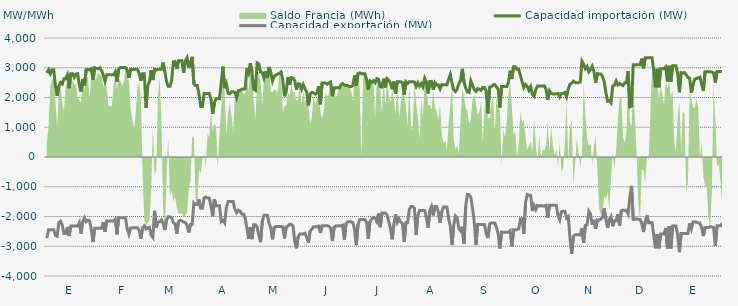
| Category | Capacidad importación (MW) | Capacidad exportación (MW) |
|---|---|---|
| 0 | 2825 | -2729.167 |
| 1900-01-01 | 2933.333 | -2441.667 |
| 1900-01-02 | 2795.833 | -2441.667 |
| 1900-01-03 | 2933.333 | -2441.667 |
| 1900-01-04 | 2933.333 | -2441.667 |
| 1900-01-05 | 2397.917 | -2637.5 |
| 1900-01-06 | 2056.25 | -2662.5 |
| 1900-01-07 | 2383.333 | -2202.083 |
| 1900-01-08 | 2500 | -2154.167 |
| 1900-01-09 | 2450 | -2293.75 |
| 1900-01-10 | 2633.333 | -2570.833 |
| 1900-01-11 | 2633.333 | -2570.833 |
| 1900-01-12 | 2762.5 | -2352.083 |
| 1900-01-13 | 2312.5 | -2656.25 |
| 1900-01-14 | 2800 | -2322.917 |
| 1900-01-15 | 2800 | -2322.917 |
| 1900-01-16 | 2683.333 | -2322.917 |
| 1900-01-17 | 2787.5 | -2322.917 |
| 1900-01-18 | 2800 | -2322.917 |
| 1900-01-19 | 2412.5 | -2206.25 |
| 1900-01-20 | 2200 | -2575 |
| 1900-01-21 | 2616.667 | -2170.833 |
| 1900-01-22 | 2404.167 | -2045.833 |
| 1900-01-23 | 2937.5 | -2170.833 |
| 1900-01-24 | 2941.667 | -2125 |
| 1900-01-25 | 2925 | -2145.833 |
| 1900-01-26 | 2968.75 | -2437.5 |
| 1900-01-27 | 2593.75 | -2854.167 |
| 1900-01-28 | 3000 | -2395.833 |
| 1900-01-29 | 2979.167 | -2395.833 |
| 1900-01-30 | 2964.583 | -2395.833 |
| 1900-01-31 | 3000 | -2395.833 |
| 1900-02-01 | 2906.25 | -2395.833 |
| 1900-02-02 | 2750 | -2187.5 |
| 1900-02-03 | 2550 | -2512.5 |
| 1900-02-04 | 2766.667 | -2154.167 |
| 1900-02-05 | 2766.667 | -2154.167 |
| 1900-02-06 | 2766.667 | -2154.167 |
| 1900-02-07 | 2766.667 | -2154.167 |
| 1900-02-08 | 2766.667 | -2154.167 |
| 1900-02-09 | 2862.5 | -2093.75 |
| 1900-02-10 | 2529.167 | -2604.167 |
| 1900-02-11 | 2945.833 | -2041.667 |
| 1900-02-12 | 3008.333 | -2041.667 |
| 1900-02-13 | 3008.333 | -2041.667 |
| 1900-02-14 | 3008.333 | -2041.667 |
| 1900-02-15 | 3008.333 | -2041.667 |
| 1900-02-16 | 2922.917 | -2412.5 |
| 1900-02-17 | 2662.5 | -2600 |
| 1900-02-18 | 2945.833 | -2389.583 |
| 1900-02-19 | 2945.833 | -2377.083 |
| 1900-02-20 | 2945.833 | -2377.083 |
| 1900-02-21 | 2945.833 | -2377.083 |
| 1900-02-22 | 2945.833 | -2379.167 |
| 1900-02-23 | 2812.5 | -2462.5 |
| 1900-02-24 | 2562.5 | -2741.667 |
| 1900-02-25 | 2802.083 | -2377.083 |
| 1900-02-26 | 2800 | -2312.5 |
| 1900-02-27 | 1650 | -2420.833 |
| 1900-02-28 | 2400 | -2379.167 |
| 1900-02-28 | 2533.333 | -2362.5 |
| 1900-03-01 | 2918.75 | -2622.917 |
| 1900-03-02 | 2587.5 | -2702.083 |
| 1900-03-03 | 2947.917 | -1808.333 |
| 1900-03-04 | 2922.917 | -2372.917 |
| 1900-03-05 | 2947.917 | -2181.25 |
| 1900-03-06 | 2947.917 | -2181.25 |
| 1900-03-07 | 2947.917 | -2114.583 |
| 1900-03-08 | 3175 | -2225 |
| 1900-03-09 | 2875 | -2454.167 |
| 1900-03-10 | 2535.417 | -2108.333 |
| 1900-03-11 | 2375 | -2012.5 |
| 1900-03-12 | 2375 | -2012.5 |
| 1900-03-13 | 2566.667 | -2043.75 |
| 1900-03-14 | 3200 | -2208.333 |
| 1900-03-15 | 3212.5 | -2250 |
| 1900-03-16 | 2962.5 | -2579.167 |
| 1900-03-17 | 3233.333 | -2166.667 |
| 1900-03-18 | 3233.333 | -2122.917 |
| 1900-03-19 | 3233.333 | -2145.833 |
| 1900-03-20 | 2829.167 | -2185.417 |
| 1900-03-21 | 3233.333 | -2208.333 |
| 1900-03-22 | 3337.5 | -2293.75 |
| 1900-03-23 | 2991.304 | -2541.304 |
| 1900-03-24 | 3183.333 | -2268.75 |
| 1900-03-25 | 3366.667 | -2268.75 |
| 1900-03-26 | 2454.583 | -1541.667 |
| 1900-03-27 | 2400 | -1600 |
| 1900-03-28 | 2400 | -1600 |
| 1900-03-29 | 2100 | -1425 |
| 1900-03-30 | 1700 | -1725 |
| 1900-03-31 | 1700 | -1725 |
| 1900-04-01 | 2133.333 | -1375 |
| 1900-04-02 | 2133.333 | -1350 |
| 1900-04-03 | 2133.333 | -1375 |
| 1900-04-04 | 2133.333 | -1375 |
| 1900-04-05 | 1943.75 | -1662.5 |
| 1900-04-06 | 1447.917 | -1991.667 |
| 1900-04-07 | 1820.833 | -1420.833 |
| 1900-04-08 | 1958.333 | -1645.833 |
| 1900-04-09 | 1958.333 | -1637.5 |
| 1900-04-10 | 1958.333 | -1637.5 |
| 1900-04-11 | 2502.083 | -2177.083 |
| 1900-04-12 | 3037.5 | -2129.167 |
| 1900-04-13 | 2312.5 | -2216.667 |
| 1900-04-14 | 2456.25 | -1702.083 |
| 1900-04-15 | 2141.667 | -1497.917 |
| 1900-04-16 | 2125 | -1497.917 |
| 1900-04-17 | 2191.667 | -1497.917 |
| 1900-04-18 | 2191.667 | -1497.917 |
| 1900-04-19 | 2175 | -1766.667 |
| 1900-04-20 | 1997.917 | -1870.833 |
| 1900-04-21 | 2233.333 | -1787.5 |
| 1900-04-22 | 2241.667 | -1818.75 |
| 1900-04-23 | 2275 | -1914.583 |
| 1900-04-24 | 2275 | -1914.583 |
| 1900-04-25 | 2304.167 | -2052.083 |
| 1900-04-26 | 2979.167 | -2385.417 |
| 1900-04-27 | 2825 | -2752.083 |
| 1900-04-28 | 3154.167 | -2358.333 |
| 1900-04-29 | 2850 | -2760.417 |
| 1900-04-30 | 2285.417 | -2275 |
| 1900-05-01 | 2239.583 | -2275 |
| 1900-05-02 | 3162.5 | -2358.333 |
| 1900-05-03 | 3127.083 | -2631.25 |
| 1900-05-04 | 2858.333 | -2862.5 |
| 1900-05-05 | 2841.667 | -2166.667 |
| 1900-05-06 | 2656.25 | -1956.25 |
| 1900-05-07 | 2883.333 | -1956.25 |
| 1900-05-08 | 2656.25 | -1956.25 |
| 1900-05-09 | 3025 | -2229.167 |
| 1900-05-10 | 2831.25 | -2393.75 |
| 1900-05-11 | 2550.625 | -2766.667 |
| 1900-05-12 | 2710.417 | -2368.75 |
| 1900-05-13 | 2754.167 | -2337.5 |
| 1900-05-14 | 2791.667 | -2337.5 |
| 1900-05-15 | 2808.333 | -2337.5 |
| 1900-05-16 | 2858.333 | -2337.5 |
| 1900-05-17 | 2581.25 | -2347.917 |
| 1900-05-18 | 2041.667 | -2737.5 |
| 1900-05-19 | 2218.75 | -2354.167 |
| 1900-05-20 | 2679.167 | -2320.833 |
| 1900-05-21 | 2427.083 | -2260.417 |
| 1900-05-22 | 2666.667 | -2260.417 |
| 1900-05-23 | 2654.167 | -2320.833 |
| 1900-05-24 | 2562.5 | -2837.5 |
| 1900-05-25 | 2264.583 | -3070.833 |
| 1900-05-26 | 2458.333 | -2672.917 |
| 1900-05-27 | 2454.167 | -2585.417 |
| 1900-05-28 | 2279.167 | -2585.417 |
| 1900-05-29 | 2431.25 | -2585.417 |
| 1900-05-30 | 2295.833 | -2562.5 |
| 1900-05-31 | 2181.25 | -2700 |
| 1900-06-01 | 1735.417 | -2883.333 |
| 1900-06-02 | 2125 | -2487.5 |
| 1900-06-03 | 2170.833 | -2429.167 |
| 1900-06-04 | 2158.333 | -2341.667 |
| 1900-06-05 | 2112.5 | -2341.667 |
| 1900-06-06 | 2158.333 | -2341.667 |
| 1900-06-07 | 2383.333 | -2325 |
| 1900-06-08 | 1772.917 | -2554.167 |
| 1900-06-09 | 2485.417 | -2308.333 |
| 1900-06-10 | 2485.417 | -2308.333 |
| 1900-06-11 | 2485.417 | -2308.333 |
| 1900-06-12 | 2447.917 | -2308.333 |
| 1900-06-13 | 2485.417 | -2333.333 |
| 1900-06-14 | 2516.667 | -2387.5 |
| 1900-06-15 | 2043.75 | -2822.917 |
| 1900-06-16 | 2331.25 | -2362.5 |
| 1900-06-17 | 2331.25 | -2320.833 |
| 1900-06-18 | 2331.25 | -2320.833 |
| 1900-06-19 | 2318.75 | -2308.333 |
| 1900-06-20 | 2425 | -2320.833 |
| 1900-06-21 | 2468.75 | -2295.833 |
| 1900-06-22 | 2418.75 | -2772.917 |
| 1900-06-23 | 2400 | -2235.417 |
| 1900-06-24 | 2400 | -2179.167 |
| 1900-06-25 | 2366.667 | -2179.167 |
| 1900-06-26 | 2366.667 | -2179.167 |
| 1900-06-27 | 2404.167 | -2200 |
| 1900-06-28 | 2743.75 | -2437.5 |
| 1900-06-29 | 2393.75 | -2964.583 |
| 1900-06-30 | 2804.167 | -2270.833 |
| 1900-07-01 | 2829.167 | -2097.917 |
| 1900-07-02 | 2800 | -2097.917 |
| 1900-07-03 | 2800 | -2097.917 |
| 1900-07-04 | 2800 | -2097.917 |
| 1900-07-05 | 2610.417 | -2200 |
| 1900-07-06 | 2264.583 | -2750 |
| 1900-07-07 | 2556.25 | -2166.667 |
| 1900-07-08 | 2506.25 | -2095.833 |
| 1900-07-09 | 2564.583 | -2029.167 |
| 1900-07-10 | 2497.917 | -2058.333 |
| 1900-07-11 | 2635.417 | -2166.667 |
| 1900-07-12 | 2612.5 | -1900 |
| 1900-07-13 | 2362.5 | -2358.333 |
| 1900-07-14 | 2350 | -1885.417 |
| 1900-07-15 | 2633.333 | -1885.417 |
| 1900-07-16 | 2341.667 | -1885.417 |
| 1900-07-17 | 2633.333 | -1943.75 |
| 1900-07-18 | 2579.167 | -2168.75 |
| 1900-07-19 | 2485.417 | -2400 |
| 1900-07-20 | 2275 | -2766.667 |
| 1900-07-21 | 2533.333 | -2252.083 |
| 1900-07-22 | 2125 | -1929.167 |
| 1900-07-23 | 2533.333 | -2195.833 |
| 1900-07-24 | 2533.333 | -2072.917 |
| 1900-07-25 | 2533.333 | -2187.5 |
| 1900-07-26 | 2500 | -2237.5 |
| 1900-07-27 | 2100 | -2856.25 |
| 1900-07-28 | 2533.333 | -2202.083 |
| 1900-07-29 | 2475 | -2202.083 |
| 1900-07-30 | 2533.333 | -1768.75 |
| 1900-07-31 | 2533.333 | -1662.5 |
| 1900-08-01 | 2533.333 | -1662.5 |
| 1900-08-02 | 2518.75 | -1725 |
| 1900-08-03 | 2375 | -2614.583 |
| 1900-08-04 | 2495.833 | -1964.583 |
| 1900-08-05 | 2383.333 | -1800 |
| 1900-08-06 | 2466.667 | -1800 |
| 1900-08-07 | 2358.333 | -1800 |
| 1900-08-08 | 2650 | -1800 |
| 1900-08-09 | 2525 | -2037.5 |
| 1900-08-10 | 2135.417 | -2381.25 |
| 1900-08-11 | 2537.5 | -1800 |
| 1900-08-12 | 2537.5 | -1662.5 |
| 1900-08-13 | 2260.417 | -1960.417 |
| 1900-08-14 | 2500 | -1662.5 |
| 1900-08-15 | 2425 | -1662.5 |
| 1900-08-16 | 2425 | -1843.75 |
| 1900-08-17 | 2287.5 | -2216.667 |
| 1900-08-18 | 2425 | -1843.75 |
| 1900-08-19 | 2425 | -1681.25 |
| 1900-08-20 | 2425 | -1681.25 |
| 1900-08-21 | 2425 | -1681.25 |
| 1900-08-22 | 2616.667 | -2062.5 |
| 1900-08-23 | 2775 | -2329.167 |
| 1900-08-24 | 2475 | -2956.25 |
| 1900-08-25 | 2258.333 | -2293.75 |
| 1900-08-26 | 2200 | -1981.25 |
| 1900-08-27 | 2283.333 | -2043.75 |
| 1900-08-28 | 2466.667 | -2410.417 |
| 1900-08-29 | 2570.833 | -2485.417 |
| 1900-08-30 | 2962.5 | -2341.667 |
| 1900-08-31 | 2512.5 | -2920.833 |
| 1900-09-01 | 2308.333 | -1650 |
| 1900-09-02 | 2187.5 | -1262.5 |
| 1900-09-03 | 2170.833 | -1262.5 |
| 1900-09-04 | 2558.333 | -1352.083 |
| 1900-09-05 | 2416.667 | -1731.25 |
| 1900-09-06 | 2266.667 | -2175 |
| 1900-09-07 | 2208.333 | -2956.25 |
| 1900-09-08 | 2300 | -2268.75 |
| 1900-09-09 | 2275 | -2266.667 |
| 1900-09-10 | 2241.667 | -2266.667 |
| 1900-09-11 | 2333.333 | -2266.667 |
| 1900-09-12 | 2333.333 | -2270.833 |
| 1900-09-13 | 2212.5 | -2581.25 |
| 1900-09-14 | 1464.583 | -2725 |
| 1900-09-15 | 2350 | -2250 |
| 1900-09-16 | 2358.333 | -2218.75 |
| 1900-09-17 | 2425 | -2218.75 |
| 1900-09-18 | 2433.333 | -2218.75 |
| 1900-09-19 | 2354.167 | -2368.75 |
| 1900-09-20 | 2279.167 | -2575 |
| 1900-09-21 | 1662.5 | -3079.167 |
| 1900-09-22 | 2366.667 | -2522.917 |
| 1900-09-23 | 2366.667 | -2527.083 |
| 1900-09-24 | 2366.667 | -2527.083 |
| 1900-09-25 | 2366.667 | -2527.083 |
| 1900-09-26 | 2508.333 | -2527.083 |
| 1900-09-27 | 2900 | -2477.083 |
| 1900-09-28 | 2620.833 | -3004.167 |
| 1900-09-29 | 3033.333 | -2443.75 |
| 1900-09-30 | 3033.333 | -2443.75 |
| 1900-10-01 | 2950 | -2443.75 |
| 1900-10-02 | 2950 | -2410.417 |
| 1900-10-03 | 2735.417 | -2081.25 |
| 1900-10-04 | 2525 | -2075 |
| 1900-10-05 | 2332.667 | -2579.167 |
| 1900-10-06 | 2437.5 | -1537.5 |
| 1900-10-07 | 2366.667 | -1262.5 |
| 1900-10-08 | 2241.667 | -1287.5 |
| 1900-10-09 | 2366.667 | -1287.5 |
| 1900-10-10 | 2108.333 | -1814.583 |
| 1900-10-11 | 2039.583 | -1625 |
| 1900-10-12 | 2264.583 | -1762.5 |
| 1900-10-13 | 2383.333 | -1625 |
| 1900-10-14 | 2383.333 | -1650 |
| 1900-10-15 | 2383.333 | -1629.167 |
| 1900-10-16 | 2383.333 | -1650 |
| 1900-10-17 | 2383.333 | -1650 |
| 1900-10-18 | 2275 | -1625 |
| 1900-10-19 | 1918.75 | -2037.5 |
| 1900-10-20 | 2225 | -1625 |
| 1900-10-21 | 2138.417 | -1625 |
| 1900-10-22 | 2120.833 | -1625 |
| 1900-10-23 | 2120.833 | -1625 |
| 1900-10-24 | 2120.833 | -1625 |
| 1900-10-25 | 2137.5 | -1975 |
| 1900-10-26 | 2020 | -2116 |
| 1900-10-27 | 2137.5 | -1841.667 |
| 1900-10-28 | 2137.5 | -1825 |
| 1900-10-29 | 2170.833 | -1825 |
| 1900-10-30 | 2022.917 | -2054.167 |
| 1900-10-31 | 2287.5 | -2000 |
| 1900-11-01 | 2445.833 | -2731.25 |
| 1900-11-02 | 2481.25 | -3254.167 |
| 1900-11-03 | 2547.917 | -2662.5 |
| 1900-11-04 | 2500 | -2616.667 |
| 1900-11-05 | 2500 | -2616.667 |
| 1900-11-06 | 2500 | -2616.667 |
| 1900-11-07 | 2520.833 | -2620.833 |
| 1900-11-08 | 3218.75 | -2393.75 |
| 1900-11-09 | 3120.833 | -2885.417 |
| 1900-11-10 | 2966.667 | -2295.833 |
| 1900-11-11 | 3041.667 | -2281.25 |
| 1900-11-12 | 2862.5 | -1822.917 |
| 1900-11-13 | 2933.333 | -1914.583 |
| 1900-11-14 | 3050 | -2281.25 |
| 1900-11-15 | 2875 | -2112.5 |
| 1900-11-16 | 2500 | -2410.417 |
| 1900-11-17 | 2804.167 | -2112.5 |
| 1900-11-18 | 2791.667 | -2125 |
| 1900-11-19 | 2791.667 | -2083.333 |
| 1900-11-20 | 2716.667 | -2031.25 |
| 1900-11-21 | 2529.167 | -1727.083 |
| 1900-11-22 | 2162.5 | -2085.417 |
| 1900-11-23 | 1872.917 | -2385.417 |
| 1900-11-24 | 1897.917 | -2095.833 |
| 1900-11-25 | 1825 | -2002.083 |
| 1900-11-26 | 2383.333 | -2325 |
| 1900-11-27 | 2418.75 | -2145.833 |
| 1900-11-28 | 2558.333 | -2145.833 |
| 1900-11-29 | 2425 | -1925 |
| 1900-11-30 | 2470.833 | -2300 |
| 1900-12-01 | 2425 | -1808.333 |
| 1900-12-02 | 2400 | -1785.417 |
| 1900-12-03 | 2495.833 | -1795.833 |
| 1900-12-04 | 2497.917 | -1789.583 |
| 1900-12-05 | 2882.917 | -1912.5 |
| 1900-12-06 | 1685.417 | -1368.75 |
| 1900-12-07 | 1712.5 | -968.75 |
| 1900-12-08 | 3104.167 | -2100 |
| 1900-12-09 | 3104.167 | -2100 |
| 1900-12-10 | 3104.167 | -2075 |
| 1900-12-11 | 3104.167 | -2100 |
| 1900-12-12 | 3104.167 | -2100 |
| 1900-12-13 | 3306.25 | -2237.5 |
| 1900-12-14 | 2981.25 | -2520.833 |
| 1900-12-15 | 3333.333 | -2189.583 |
| 1900-12-16 | 3333.333 | -1964.583 |
| 1900-12-17 | 3333.333 | -2212.5 |
| 1900-12-18 | 3333.333 | -2212.5 |
| 1900-12-19 | 3333.333 | -2212.5 |
| 1900-12-20 | 2904.167 | -2625 |
| 1900-12-21 | 2343.75 | -3068.75 |
| 1900-12-22 | 2966.667 | -2589.583 |
| 1900-12-23 | 2343.75 | -3068.75 |
| 1900-12-24 | 2966.667 | -2589.583 |
| 1900-12-25 | 2966.667 | -2589.583 |
| 1900-12-26 | 2966.667 | -2589.583 |
| 1900-12-27 | 3025 | -2385.417 |
| 1900-12-28 | 2525 | -3075 |
| 1900-12-29 | 3066.667 | -2320.833 |
| 1900-12-30 | 2525 | -3075 |
| 1900-12-31 | 3066.667 | -2320.833 |
| 1901-01-01 | 3066.667 | -2320.833 |
| 1901-01-02 | 3066.667 | -2320.833 |
| 1901-01-03 | 2800 | -2622.917 |
| 1901-01-04 | 2177.083 | -3197.917 |
| 1901-01-05 | 2837.5 | -2568.75 |
| 1901-01-06 | 2820.833 | -2568.75 |
| 1901-01-07 | 2837.5 | -2568.75 |
| 1901-01-08 | 2758.333 | -2568.75 |
| 1901-01-09 | 2675 | -2568.75 |
| 1901-01-10 | 2641.667 | -2233.333 |
| 1901-01-11 | 2156.25 | -2418.75 |
| 1901-01-12 | 2450 | -2181.25 |
| 1901-01-13 | 2616.667 | -2179.167 |
| 1901-01-14 | 2637.5 | -2187.5 |
| 1901-01-15 | 2658.333 | -2216.667 |
| 1901-01-16 | 2683.333 | -2216.667 |
| 1901-01-17 | 2450 | -2362.5 |
| 1901-01-18 | 2231.25 | -2658.333 |
| 1901-01-19 | 2866.667 | -2372.917 |
| 1901-01-20 | 2866.667 | -2372.917 |
| 1901-01-21 | 2866.667 | -2372.917 |
| 1901-01-22 | 2866.667 | -2339.583 |
| 1901-01-23 | 2854.167 | -2352.083 |
| 1901-01-24 | 2825 | -2368.75 |
| 1901-01-25 | 2504.167 | -2991.667 |
| 1901-01-26 | 2875 | -2314.583 |
| 1901-01-27 | 2875 | -2314.583 |
| 1901-01-28 | 2875 | -2314.583 |
| 1901-01-29 | 2875 | -2231.25 |